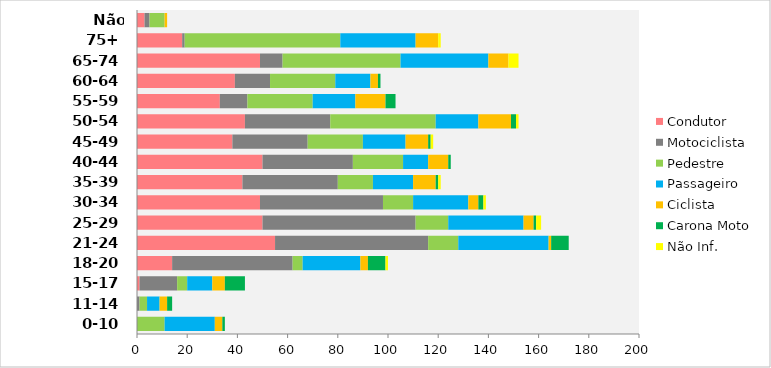
| Category | Condutor | Motociclista | Pedestre | Passageiro | Ciclista | Carona Moto | Não Inf. |
|---|---|---|---|---|---|---|---|
| 0-10 | 0 | 0 | 11 | 20 | 3 | 1 | 0 |
| 11-14 | 0 | 1 | 3 | 5 | 3 | 2 | 0 |
| 15-17 | 1 | 15 | 4 | 10 | 5 | 8 | 0 |
| 18-20 | 14 | 48 | 4 | 23 | 3 | 7 | 1 |
| 21-24 | 55 | 61 | 12 | 36 | 1 | 7 | 0 |
| 25-29 | 50 | 61 | 13 | 30 | 4 | 1 | 2 |
| 30-34 | 49 | 49 | 12 | 22 | 4 | 2 | 1 |
| 35-39 | 42 | 38 | 14 | 16 | 9 | 1 | 1 |
| 40-44 | 50 | 36 | 20 | 10 | 8 | 1 | 0 |
| 45-49 | 38 | 30 | 22 | 17 | 9 | 1 | 1 |
| 50-54 | 43 | 34 | 42 | 17 | 13 | 2 | 1 |
| 55-59 | 33 | 11 | 26 | 17 | 12 | 4 | 0 |
| 60-64 | 39 | 14 | 26 | 14 | 3 | 1 | 0 |
| 65-74 | 49 | 9 | 47 | 35 | 8 | 0 | 4 |
| 75+ | 18 | 1 | 62 | 30 | 9 | 0 | 1 |
| Não informado | 3 | 2 | 6 | 0 | 1 | 0 | 0 |